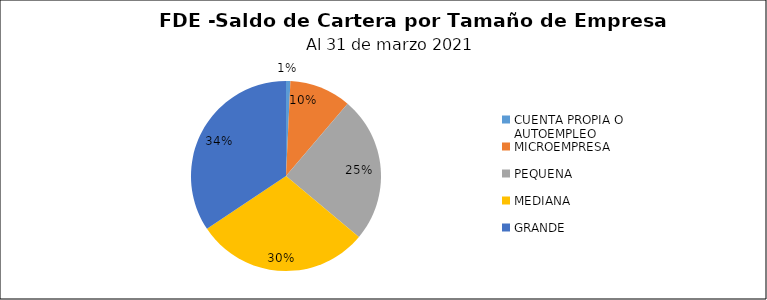
| Category | Saldo | Créditos |
|---|---|---|
| CUENTA PROPIA O AUTOEMPLEO | 0.447 | 31 |
| MICROEMPRESA | 6.29 | 417 |
| PEQUENA | 14.915 | 233 |
| MEDIANA | 17.74 | 62 |
| GRANDE | 20.626 | 36 |